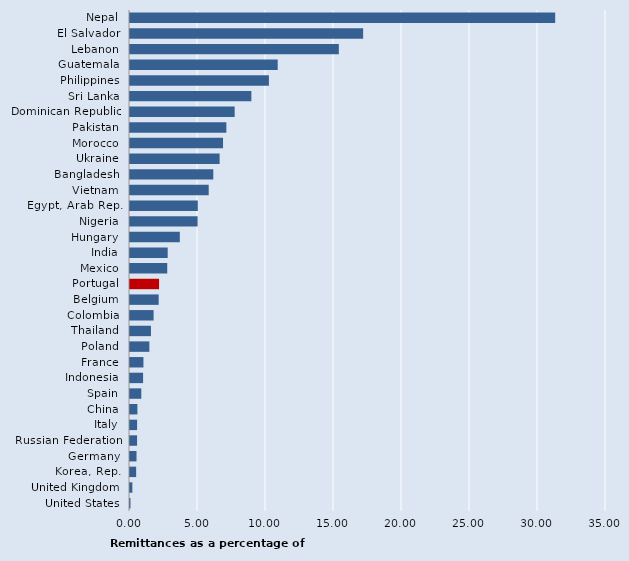
| Category | Series 0 |
|---|---|
| Nepal | 31.264 |
| El Salvador | 17.143 |
| Lebanon | 15.354 |
| Guatemala | 10.861 |
| Philippines | 10.215 |
| Sri Lanka | 8.924 |
| Dominican Republic | 7.696 |
| Pakistan | 7.085 |
| Morocco | 6.841 |
| Ukraine | 6.589 |
| Bangladesh | 6.124 |
| Vietnam | 5.787 |
| Egypt, Arab Rep. | 4.985 |
| Nigeria | 4.97 |
| Hungary | 3.663 |
| India | 2.772 |
| Mexico | 2.739 |
| Portugal | 2.137 |
| Belgium | 2.109 |
| Colombia | 1.736 |
| Thailand | 1.541 |
| Poland | 1.424 |
| France | 0.989 |
| Indonesia | 0.963 |
| Spain | 0.831 |
| China | 0.545 |
| Italy | 0.523 |
| Russian Federation | 0.52 |
| Germany | 0.48 |
| Korea, Rep. | 0.453 |
| United Kingdom | 0.172 |
| United States | 0.035 |